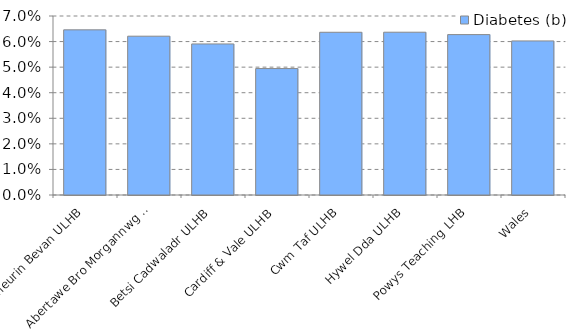
| Category | Diabetes (b) |
|---|---|
| Aneurin Bevan ULHB | 0.065 |
| Abertawe Bro Morgannwg ULHB | 0.062 |
| Betsi Cadwaladr ULHB | 0.059 |
| Cardiff & Vale ULHB | 0.049 |
| Cwm Taf ULHB | 0.064 |
| Hywel Dda ULHB | 0.064 |
| Powys Teaching LHB | 0.063 |
| Wales | 0.06 |